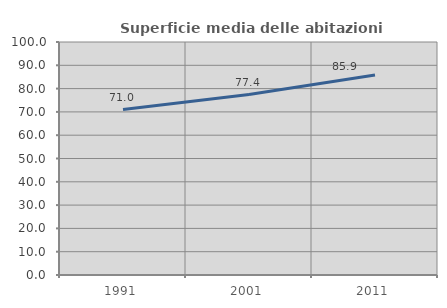
| Category | Superficie media delle abitazioni occupate |
|---|---|
| 1991.0 | 71.026 |
| 2001.0 | 77.448 |
| 2011.0 | 85.865 |